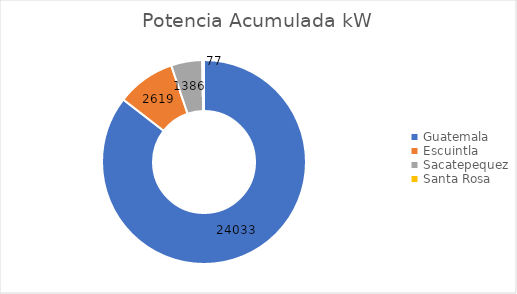
| Category | Potencia Acumulada kW |
|---|---|
| Guatemala | 24033 |
| Escuintla | 2619 |
| Sacatepequez | 1386 |
| Santa Rosa | 77 |